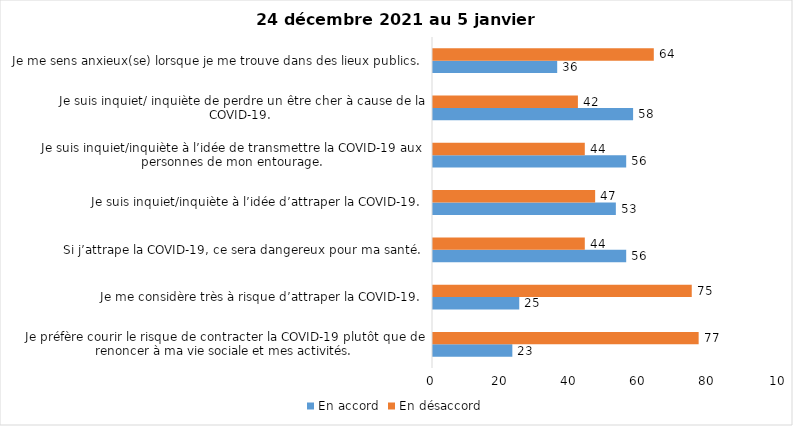
| Category | En accord | En désaccord |
|---|---|---|
| Je préfère courir le risque de contracter la COVID-19 plutôt que de renoncer à ma vie sociale et mes activités. | 23 | 77 |
| Je me considère très à risque d’attraper la COVID-19. | 25 | 75 |
| Si j’attrape la COVID-19, ce sera dangereux pour ma santé. | 56 | 44 |
| Je suis inquiet/inquiète à l’idée d’attraper la COVID-19. | 53 | 47 |
| Je suis inquiet/inquiète à l’idée de transmettre la COVID-19 aux personnes de mon entourage. | 56 | 44 |
| Je suis inquiet/ inquiète de perdre un être cher à cause de la COVID-19. | 58 | 42 |
| Je me sens anxieux(se) lorsque je me trouve dans des lieux publics. | 36 | 64 |